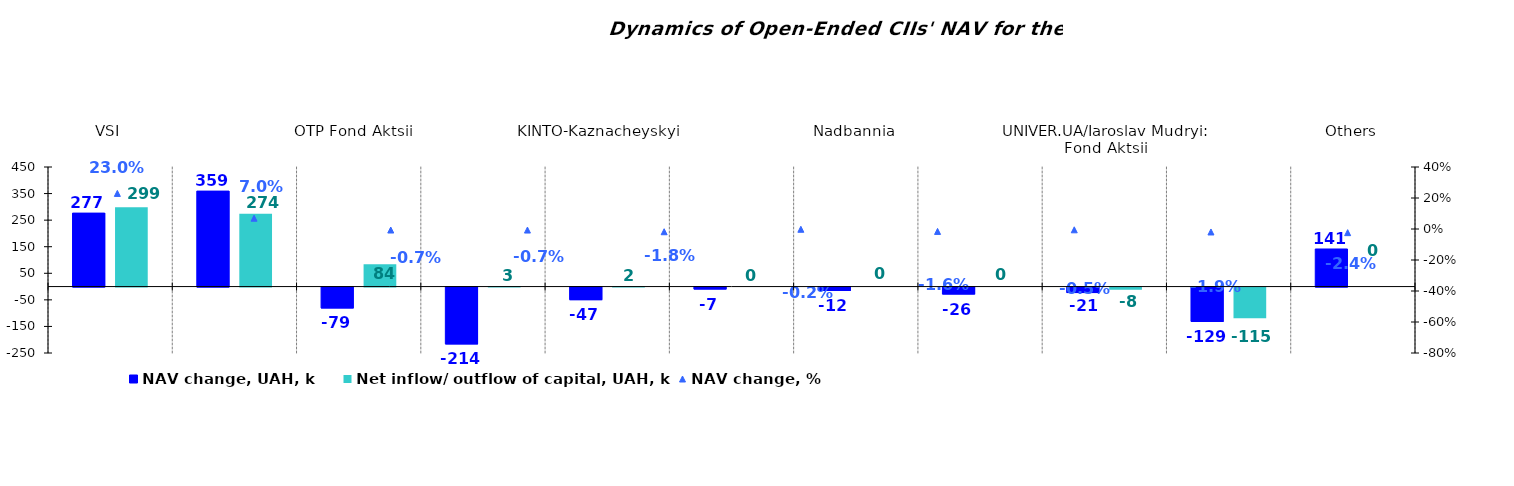
| Category | NAV change, UAH, k | Net inflow/ outflow of capital, UAH, k |
|---|---|---|
| VSI | 276.512 | 298.659 |
| OTP Klasychnyi' | 359.311 | 274.355 |
| OTP Fond Aktsii   | -78.623 | 84.38 |
| КІNТО-Klasychnyi | -213.795 | 2.575 |
| KINTO-Kaznacheyskyi    | -47.247 | 2.39 |
| Altus – Depozyt | -7.449 | 0 |
| Nadbannia | -12.479 | 0 |
| Sofiivskyi | -26.393 | 0 |
| UNIVER.UA/Iaroslav Mudryi: Fond Aktsii | -20.778 | -7.953 |
| КІNТО-Еkviti | -129.202 | -115.194 |
| Others | 141.446 | 0 |